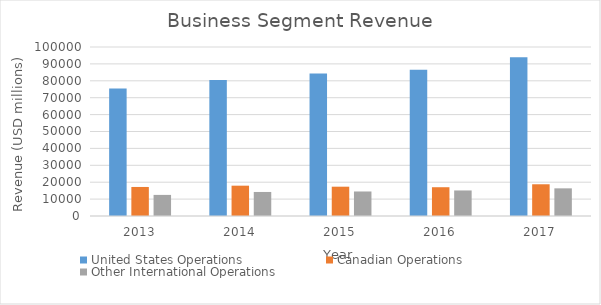
| Category | United States Operations | Canadian Operations | Other International Operations |
|---|---|---|---|
| 2013.0 | 75493 | 17179 | 12484 |
| 2014.0 | 80477 | 17943 | 14220 |
| 2015.0 | 84351 | 17341 | 14507 |
| 2016.0 | 86579 | 17028 | 15112 |
| 2017.0 | 93889 | 18775 | 16361 |